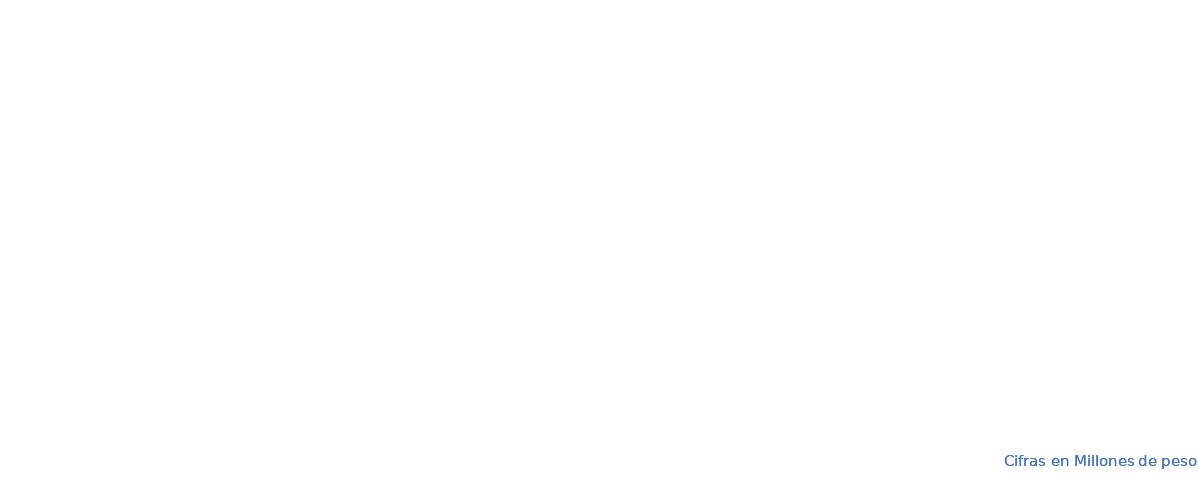
| Category | APROPIACION | COMPROMISOS |  OBLIGACIONES |
|---|---|---|---|
| A-FUNCIONAMIENTO | 99785.985 | 98576.238 | 88619.939 |
| B-SERVICIO DE LA DEUDA PÚBLICA | 1167604.335 | 1167604.335 | 1167604.335 |
| C- INVERSION | 4505182.025 | 4481324.211 | 4435462.814 |